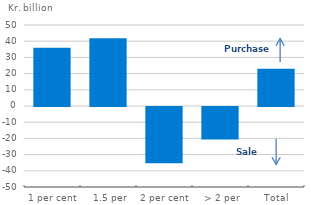
| Category | Series 1 |
|---|---|
| 1 per cent | 36 |
| 1.5 per cent | 41.8 |
| 2 per cent | -34.7 |
| > 2 per cent | -20.1 |
| Total | 23 |